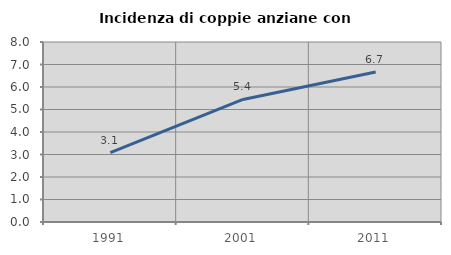
| Category | Incidenza di coppie anziane con figli |
|---|---|
| 1991.0 | 3.084 |
| 2001.0 | 5.446 |
| 2011.0 | 6.667 |